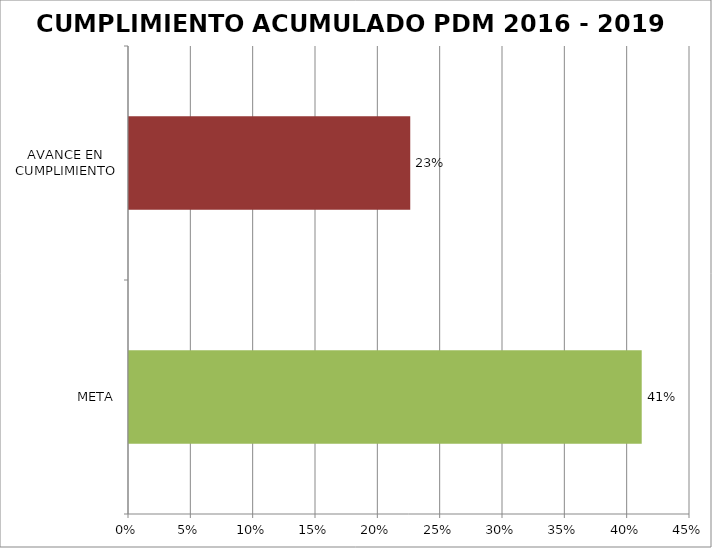
| Category | Series 0 |
|---|---|
| META | 0.411 |
| AVANCE EN CUMPLIMIENTO | 0.226 |